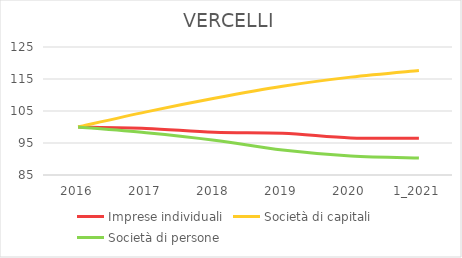
| Category | Imprese individuali | Società di capitali | Società di persone |
|---|---|---|---|
| 2016 | 100 | 100 | 100 |
| 2017 | 99.566 | 104.736 | 98.228 |
| 2018 | 98.349 | 108.966 | 95.879 |
| 2019 | 98.054 | 112.736 | 92.778 |
| 2020 | 96.576 | 115.586 | 90.917 |
| 1_2021 | 96.507 | 117.655 | 90.297 |